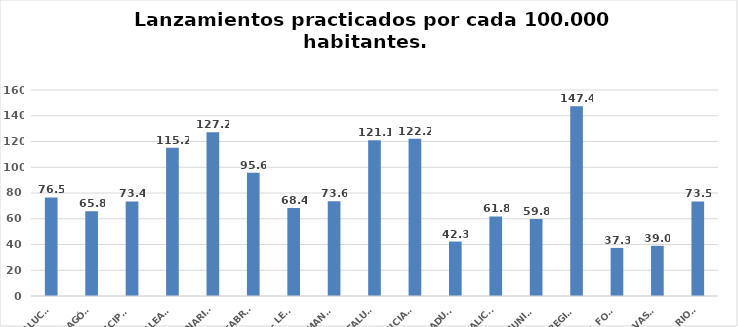
| Category | Series 0 |
|---|---|
| ANDALUCÍA | 76.543 |
| ARAGÓN | 65.824 |
| ASTURIAS, PRINCIPADO | 73.434 |
| ILLES BALEARS | 115.174 |
| CANARIAS | 127.155 |
| CANTABRIA | 95.636 |
| CASTILLA - LEÓN | 68.355 |
| CASTILLA - LA MANCHA | 73.577 |
| CATALUÑA | 121.056 |
| C. VALENCIANA | 122.219 |
| EXTREMADURA | 42.284 |
| GALICIA | 61.84 |
| MADRID, COMUNIDAD | 59.826 |
| MURCIA, REGIÓN | 147.449 |
| NAVARRA, COM. FORAL | 37.337 |
| PAÍS VASCO | 38.979 |
| LA RIOJA | 73.484 |